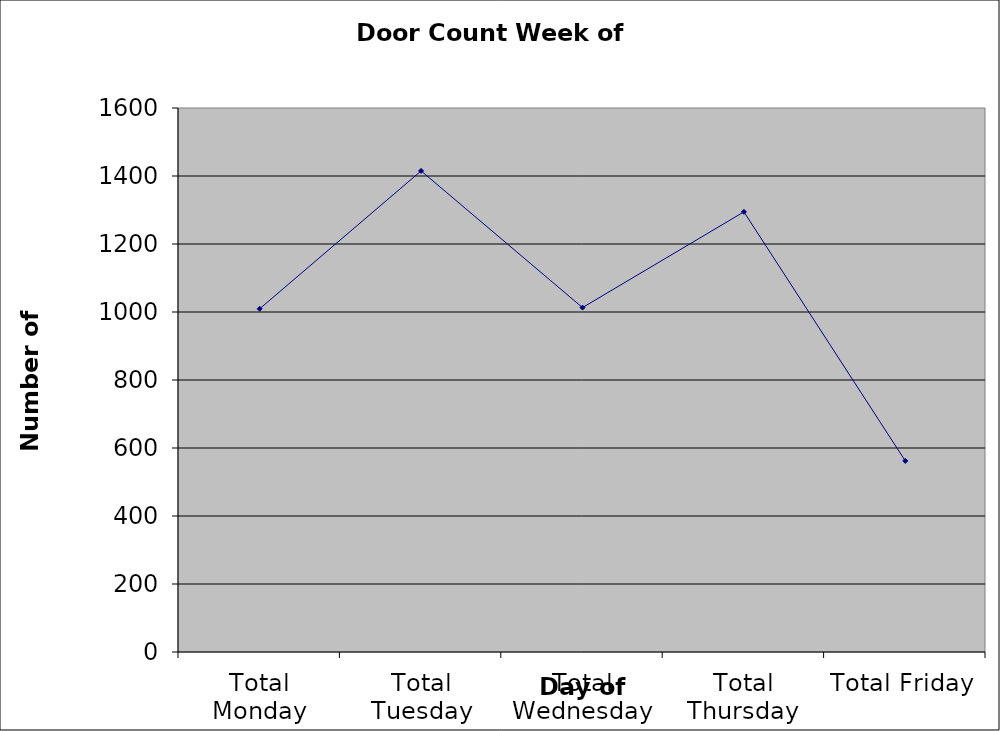
| Category | Series 0 |
|---|---|
| Total Monday | 1009.5 |
| Total Tuesday | 1415 |
| Total Wednesday | 1013 |
| Total Thursday | 1294.5 |
| Total Friday | 562 |